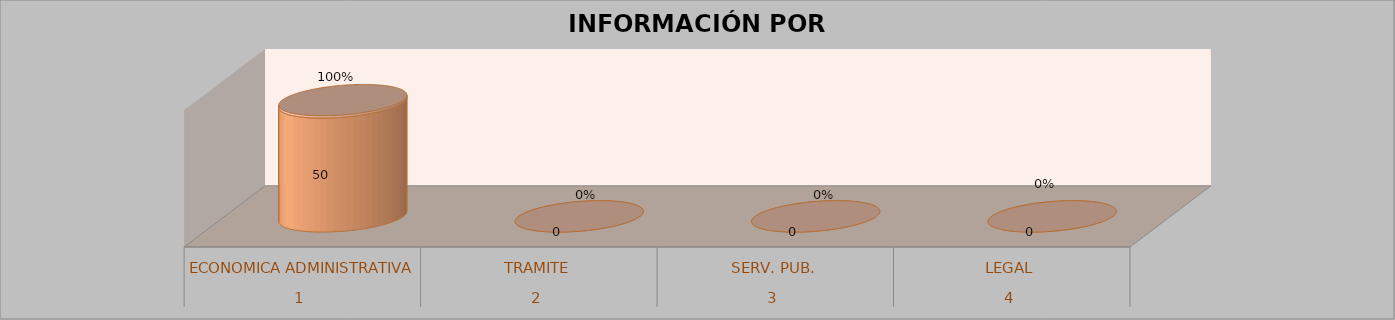
| Category | Series 0 | Series 1 | Series 2 | Series 3 |
|---|---|---|---|---|
| 0 |  |  | 50 | 1 |
| 1 |  |  | 0 | 0 |
| 2 |  |  | 0 | 0 |
| 3 |  |  | 0 | 0 |